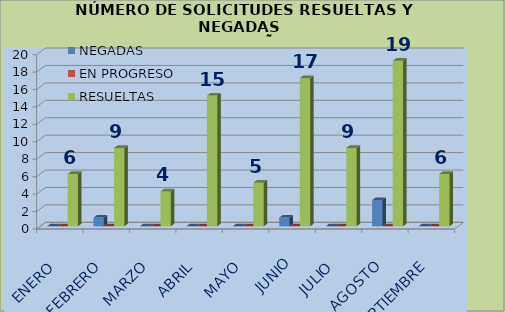
| Category | NEGADAS | EN PROGRESO | RESUELTAS |
|---|---|---|---|
| ENERO | 0 | 0 | 6 |
| FEBRERO | 1 | 0 | 9 |
| MARZO | 0 | 0 | 4 |
| ABRIL | 0 | 0 | 15 |
| MAYO | 0 | 0 | 5 |
| JUNIO | 1 | 0 | 17 |
| JULIO | 0 | 0 | 9 |
| AGOSTO | 3 | 0 | 19 |
| SEPTIEMBRE | 0 | 0 | 6 |